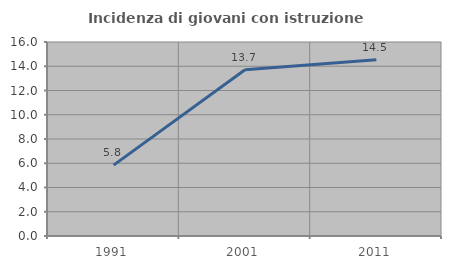
| Category | Incidenza di giovani con istruzione universitaria |
|---|---|
| 1991.0 | 5.848 |
| 2001.0 | 13.717 |
| 2011.0 | 14.535 |